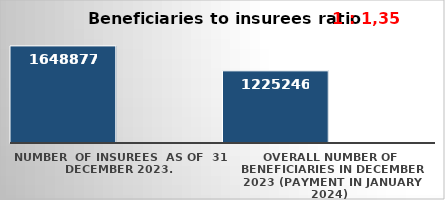
| Category | Series 0 | Series 1 |
|---|---|---|
| NUMBER  of insurees  as of  31 December 2023. | 1648877 |  |
| OVERALL number of beneficiaries in December 2023 (payment in January 2024) | 1225246 |  |